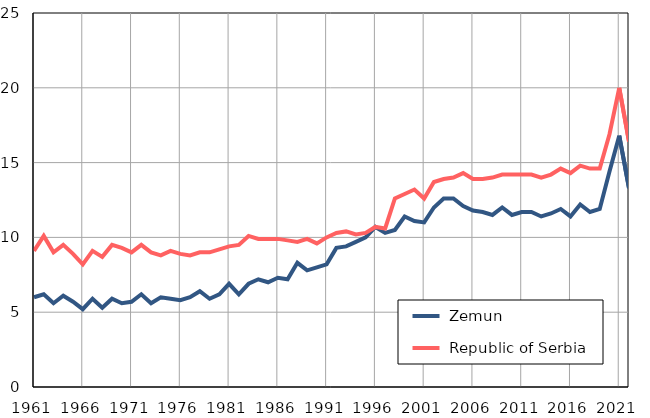
| Category |  Zemun |  Republic of Serbia |
|---|---|---|
| 1961.0 | 6 | 9.1 |
| 1962.0 | 6.2 | 10.1 |
| 1963.0 | 5.6 | 9 |
| 1964.0 | 6.1 | 9.5 |
| 1965.0 | 5.7 | 8.9 |
| 1966.0 | 5.2 | 8.2 |
| 1967.0 | 5.9 | 9.1 |
| 1968.0 | 5.3 | 8.7 |
| 1969.0 | 5.9 | 9.5 |
| 1970.0 | 5.6 | 9.3 |
| 1971.0 | 5.7 | 9 |
| 1972.0 | 6.2 | 9.5 |
| 1973.0 | 5.6 | 9 |
| 1974.0 | 6 | 8.8 |
| 1975.0 | 5.9 | 9.1 |
| 1976.0 | 5.8 | 8.9 |
| 1977.0 | 6 | 8.8 |
| 1978.0 | 6.4 | 9 |
| 1979.0 | 5.9 | 9 |
| 1980.0 | 6.2 | 9.2 |
| 1981.0 | 6.9 | 9.4 |
| 1982.0 | 6.2 | 9.5 |
| 1983.0 | 6.9 | 10.1 |
| 1984.0 | 7.2 | 9.9 |
| 1985.0 | 7 | 9.9 |
| 1986.0 | 7.3 | 9.9 |
| 1987.0 | 7.2 | 9.8 |
| 1988.0 | 8.3 | 9.7 |
| 1989.0 | 7.8 | 9.9 |
| 1990.0 | 8 | 9.6 |
| 1991.0 | 8.2 | 10 |
| 1992.0 | 9.3 | 10.3 |
| 1993.0 | 9.4 | 10.4 |
| 1994.0 | 9.7 | 10.2 |
| 1995.0 | 10 | 10.3 |
| 1996.0 | 10.7 | 10.7 |
| 1997.0 | 10.3 | 10.6 |
| 1998.0 | 10.5 | 12.6 |
| 1999.0 | 11.4 | 12.9 |
| 2000.0 | 11.1 | 13.2 |
| 2001.0 | 11 | 12.6 |
| 2002.0 | 12 | 13.7 |
| 2003.0 | 12.6 | 13.9 |
| 2004.0 | 12.6 | 14 |
| 2005.0 | 12.1 | 14.3 |
| 2006.0 | 11.8 | 13.9 |
| 2007.0 | 11.7 | 13.9 |
| 2008.0 | 11.5 | 14 |
| 2009.0 | 12 | 14.2 |
| 2010.0 | 11.5 | 14.2 |
| 2011.0 | 11.7 | 14.2 |
| 2012.0 | 11.7 | 14.2 |
| 2013.0 | 11.4 | 14 |
| 2014.0 | 11.6 | 14.2 |
| 2015.0 | 11.9 | 14.6 |
| 2016.0 | 11.4 | 14.3 |
| 2017.0 | 12.2 | 14.8 |
| 2018.0 | 11.7 | 14.6 |
| 2019.0 | 11.9 | 14.6 |
| 2020.0 | 14.4 | 16.9 |
| 2021.0 | 16.8 | 20 |
| 2022.0 | 13.3 | 16.4 |